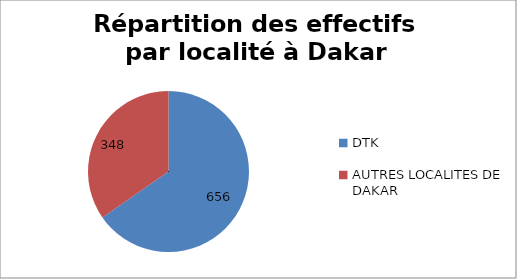
| Category | Series 0 |
|---|---|
| DTK | 656 |
| AUTRES LOCALITES DE DAKAR | 348 |